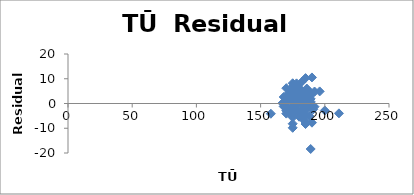
| Category | Series 0 |
|---|---|
| 170.0 | -1.523 |
| 175.0 | -8.173 |
| 185.0 | -0.469 |
| 176.0 | 1.11 |
| 183.0 | -1.754 |
| 186.0 | 5.378 |
| 200.0 | -2.83 |
| 171.0 | -1.956 |
| 186.0 | 3.419 |
| 185.0 | -2.58 |
| 185.0 | -0.732 |
| 185.0 | -2.299 |
| 175.0 | -4.629 |
| 178.0 | 1.699 |
| 183.0 | 2.136 |
| 179.0 | -3.129 |
| 185.0 | 10.268 |
| 190.0 | -7.752 |
| 176.0 | 6.826 |
| 177.0 | 0.417 |
| 170.0 | -2.893 |
| 172.0 | -3.131 |
| 175.0 | -2.543 |
| 172.0 | 4.24 |
| 176.0 | 1.394 |
| 168.0 | 2.629 |
| 175.0 | -1.543 |
| 190.0 | -1.098 |
| 175.0 | -2.543 |
| 171.0 | 0.933 |
| 175.0 | -0.889 |
| 180.0 | 4.091 |
| 176.0 | 4.85 |
| 183.0 | -2.235 |
| 181.0 | 0.719 |
| 183.0 | 0.765 |
| 178.0 | -0.301 |
| 178.0 | -0.671 |
| 185.0 | -7.448 |
| 175.0 | -5.629 |
| 190.0 | 10.532 |
| 172.0 | -2.608 |
| 186.0 | 2.921 |
| 185.0 | 1.161 |
| 184.0 | -5.014 |
| 170.0 | 6.194 |
| 175.0 | 3.198 |
| 189.0 | 0.685 |
| 172.0 | -3.781 |
| 190.0 | 3.77 |
| 173.0 | 1.588 |
| 175.0 | -3.691 |
| 187.0 | 3.944 |
| 175.0 | -3.543 |
| 182.0 | 5.199 |
| 182.0 | -3.69 |
| 168.0 | -1.198 |
| 180.0 | -5.341 |
| 186.0 | 2.945 |
| 158.0 | -4.141 |
| 183.0 | 0.419 |
| 175.0 | -9.823 |
| 180.0 | 6.115 |
| 167.0 | 0.128 |
| 185.0 | 2.136 |
| 192.0 | -1.295 |
| 190.0 | -2.23 |
| 185.0 | -8.296 |
| 211.0 | -3.98 |
| 170.0 | -4.087 |
| 184.0 | -0.841 |
| 189.0 | 1.879 |
| 173.0 | 5.695 |
| 191.0 | -2.359 |
| 179.0 | 6.611 |
| 189.0 | -18.381 |
| 183.0 | -6.321 |
| 183.0 | 2.115 |
| 177.0 | 6.372 |
| 182.0 | 8.68 |
| 170.0 | 2.457 |
| 189.0 | 4.336 |
| 186.0 | 6.032 |
| 185.0 | -4.756 |
| 192.0 | 4.837 |
| 176.0 | -1.738 |
| 178.0 | 8.135 |
| 196.0 | 4.884 |
| 175.0 | 8.177 |
| 190.0 | -1.098 |
| 188.0 | -5.058 |